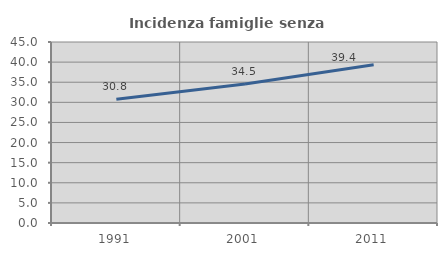
| Category | Incidenza famiglie senza nuclei |
|---|---|
| 1991.0 | 30.769 |
| 2001.0 | 34.537 |
| 2011.0 | 39.355 |